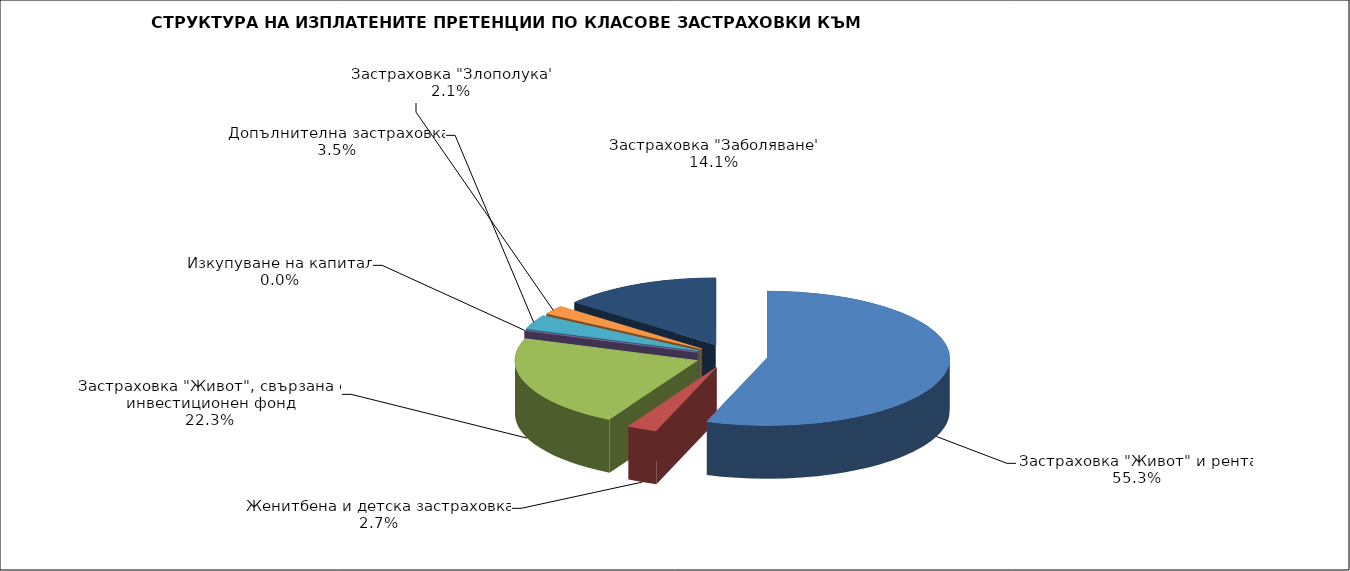
| Category | 10 297 438 |
|---|---|
| Застраховка "Живот" и рента | 10297438.184 |
| Женитбена и детска застраховка | 495029.53 |
| Застраховка "Живот", свързана с инвестиционен фонд | 4145453.654 |
| Изкупуване на капитал | 0 |
| Допълнителна застраховка | 653265.869 |
| Застраховка "Злополука" | 392982.427 |
| Застраховка "Заболяване" | 2621604.298 |